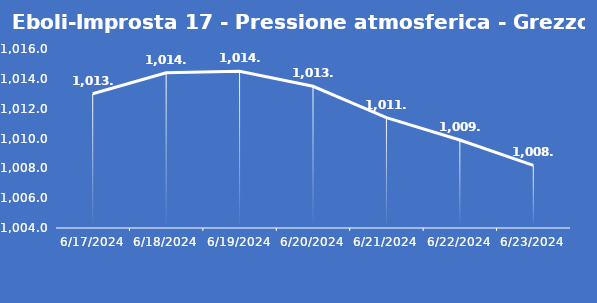
| Category | Eboli-Improsta 17 - Pressione atmosferica - Grezzo (hPa) |
|---|---|
| 6/17/24 | 1013 |
| 6/18/24 | 1014.4 |
| 6/19/24 | 1014.5 |
| 6/20/24 | 1013.5 |
| 6/21/24 | 1011.4 |
| 6/22/24 | 1009.9 |
| 6/23/24 | 1008.2 |